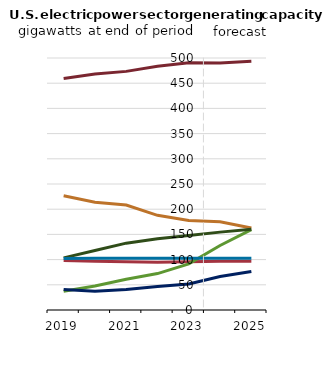
| Category | Nuclear | Coal | Natural gas | Solar | Other | Series 2 | Series 5 |
|---|---|---|---|---|---|---|---|
| 2019.0 | 98.119 | 226.809 | 459.516 | 37.029 | 40.859 | 103.453 | 102.262 |
| 2020.0 | 96.501 | 213.95 | 468.16 | 47.586 | 37.355 | 118.031 | 102.652 |
| 2021.0 | 95.546 | 208.326 | 473.459 | 61.009 | 40.72 | 132.629 | 102.618 |
| 2022.0 | 94.659 | 187.872 | 483.615 | 72.248 | 46.721 | 141.275 | 102.815 |
| 2023.0 | 95.773 | 177.508 | 490.688 | 91.439 | 51.792 | 147.645 | 102.827 |
| 2024.0 | 96.887 | 174.999 | 490.152 | 127.941 | 66.523 | 154.502 | 102.808 |
| 2025.0 | 96.932 | 162.87 | 493.532 | 159.556 | 76.576 | 160.094 | 102.879 |